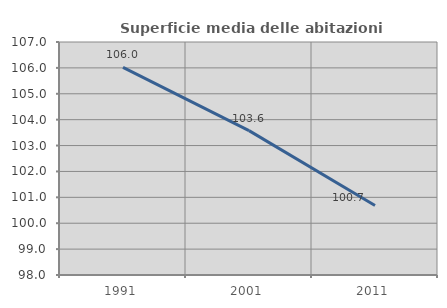
| Category | Superficie media delle abitazioni occupate |
|---|---|
| 1991.0 | 106.017 |
| 2001.0 | 103.576 |
| 2011.0 | 100.688 |